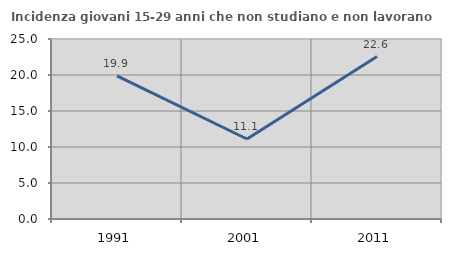
| Category | Incidenza giovani 15-29 anni che non studiano e non lavorano  |
|---|---|
| 1991.0 | 19.892 |
| 2001.0 | 11.111 |
| 2011.0 | 22.561 |